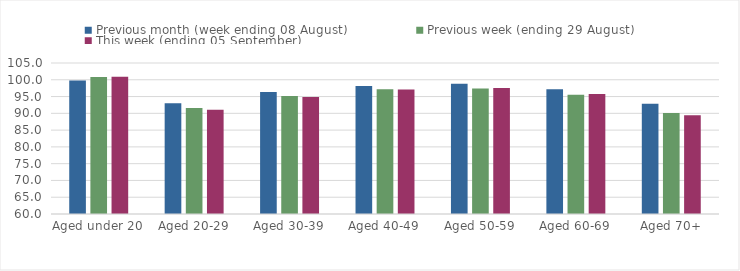
| Category | Previous month (week ending 08 August) | Previous week (ending 29 August) | This week (ending 05 September) |
|---|---|---|---|
| Aged under 20 | 99.8 | 100.85 | 100.9 |
| Aged 20-29 | 93.02 | 91.56 | 91.09 |
| Aged 30-39 | 96.33 | 95.14 | 94.87 |
| Aged 40-49 | 98.15 | 97.19 | 97.09 |
| Aged 50-59 | 98.81 | 97.4 | 97.55 |
| Aged 60-69 | 97.15 | 95.56 | 95.76 |
| Aged 70+ | 92.85 | 90.1 | 89.45 |